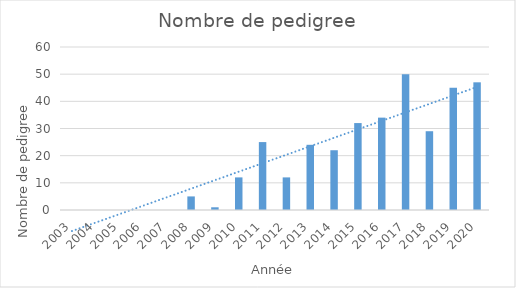
| Category | Series 0 |
|---|---|
| 2003.0 | 0 |
| 2004.0 | 0 |
| 2005.0 | 0 |
| 2006.0 | 0 |
| 2007.0 | 0 |
| 2008.0 | 5 |
| 2009.0 | 1 |
| 2010.0 | 12 |
| 2011.0 | 25 |
| 2012.0 | 12 |
| 2013.0 | 24 |
| 2014.0 | 22 |
| 2015.0 | 32 |
| 2016.0 | 34 |
| 2017.0 | 50 |
| 2018.0 | 29 |
| 2019.0 | 45 |
| 2020.0 | 47 |